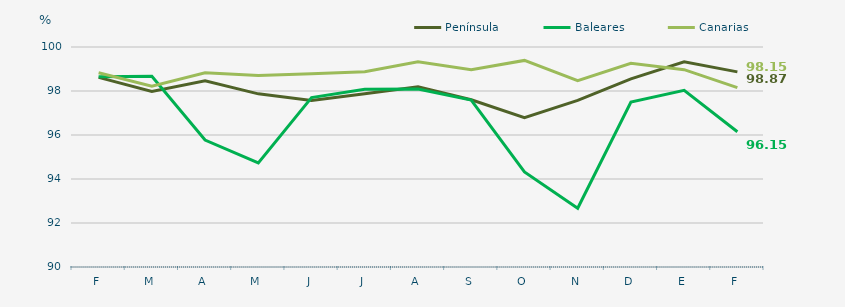
| Category | Península | Baleares | Canarias |
|---|---|---|---|
| F | 98.62 | 98.65 | 98.83 |
| M | 97.98 | 98.67 | 98.22 |
| A | 98.46 | 95.77 | 98.83 |
| M | 97.87 | 94.73 | 98.7 |
| J | 97.57 | 97.7 | 98.78 |
| J | 97.87 | 98.08 | 98.88 |
| A | 98.19 | 98.09 | 99.33 |
| S | 97.6 | 97.59 | 98.97 |
| O | 96.79 | 94.32 | 99.39 |
| N | 97.57 | 92.67 | 98.47 |
| D | 98.55 | 97.5 | 99.26 |
| E | 99.33 | 98.03 | 98.97 |
| F | 98.87 | 96.15 | 98.15 |